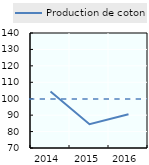
| Category | Production de coton |
|---|---|
| 2014.0 | 104.387 |
| 2015.0 | 84.464 |
| 2016.0 | 90.584 |